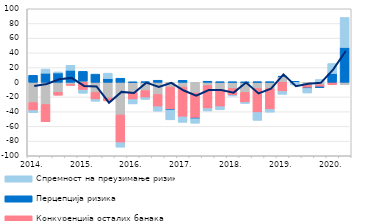
| Category | Трошкови извора за кредите | Конкуренција осталих банака | Перцепција ризика | Спремност на преузимање ризика |
|---|---|---|---|---|
| 2014. | -27.614 | -10.883 | 9.484 | -2.931 |
|  | -30.154 | -23.565 | 12.376 | 5.591 |
|  | -13.58 | -4.04 | 12.739 | 1.322 |
|  | -3.194 | -0.943 | 16.324 | 6.815 |
| 2015. | 1.584 | -10.634 | 13.285 | -4.309 |
|  | -13.709 | -9.748 | 11.117 | -2.291 |
|  | -21.32 | -4.036 | 5.049 | 7.435 |
|  | -44.371 | -37.787 | 5.514 | -6.068 |
| 2016. | -13.683 | -9.865 | 0.112 | -5.896 |
|  | -11.339 | -9.602 | 0.723 | -2.332 |
|  | -16.54 | -16.708 | 2.765 | -6.073 |
|  | -6.439 | -30.804 | -0.484 | -13.396 |
| 2017. | -6.563 | -40.484 | 2.656 | -7.434 |
|  | -14.708 | -34.121 | -0.712 | -6.144 |
|  | -4.365 | -31.359 | 1.462 | -3.307 |
|  | -9.63 | -23.589 | 0.436 | -4.267 |
| 2018. | -8.401 | -9.465 | 0.383 | -0.758 |
|  | -13.817 | -13.719 | 0.033 | -1.188 |
|  | -8.391 | -32.723 | 0.518 | -10.656 |
|  | -8.386 | -28.581 | 0.546 | -3.682 |
| 2019. | 7.614 | -12.529 | 0.567 | -3.764 |
|  | -0.003 | 0 | 1.352 | -3.594 |
|  | -3.529 | -4.583 | -0.182 | -6.275 |
|  | -3.387 | -3.387 | -0.185 | 3.746 |
| 2020. | 0 | -3.3 | 12 | 13.5 |